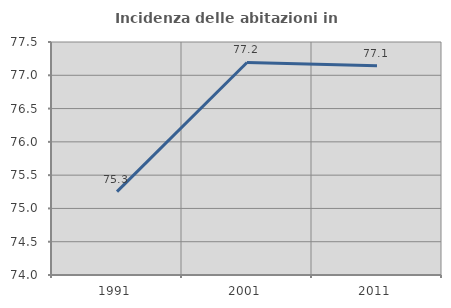
| Category | Incidenza delle abitazioni in proprietà  |
|---|---|
| 1991.0 | 75.253 |
| 2001.0 | 77.193 |
| 2011.0 | 77.143 |